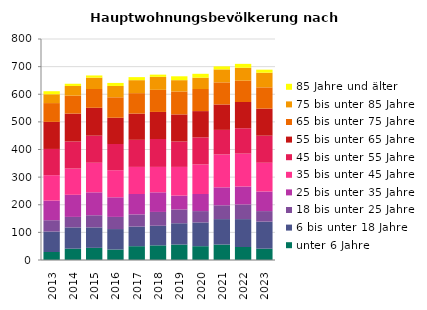
| Category | unter 6 Jahre | 6 bis unter 18 Jahre | 18 bis unter 25 Jahre | 25 bis unter 35 Jahre | 35 bis unter 45 Jahre | 45 bis unter 55 Jahre | 55 bis unter 65 Jahre | 65 bis unter 75 Jahre | 75 bis unter 85 Jahre | 85 Jahre und älter |
|---|---|---|---|---|---|---|---|---|---|---|
| 2013.0 | 29 | 74 | 41 | 71 | 92 | 95 | 98 | 68 | 32 | 11 |
| 2014.0 | 41 | 77 | 38 | 80 | 95 | 98 | 101 | 65 | 35 | 8 |
| 2015.0 | 44 | 74 | 44 | 83 | 107 | 98 | 101 | 68 | 41 | 8 |
| 2016.0 | 38 | 74 | 44 | 71 | 98 | 95 | 95 | 74 | 41 | 11 |
| 2017.0 | 50 | 71 | 44 | 74 | 98 | 98 | 95 | 74 | 47 | 11 |
| 2018.0 | 53 | 71 | 50 | 71 | 92 | 101 | 98 | 80 | 47 | 8 |
| 2019.0 | 56 | 77 | 50 | 50 | 104 | 92 | 98 | 83 | 41 | 14 |
| 2020.0 | 50 | 86 | 41 | 62 | 107 | 98 | 95 | 80 | 41 | 14 |
| 2021.0 | 56 | 92 | 50 | 65 | 119 | 89 | 92 | 80 | 47 | 11 |
| 2022.0 | 47 | 101 | 53 | 65 | 119 | 92 | 95 | 77 | 47 | 14 |
| 2023.0 | 41 | 98 | 38 | 71 | 104 | 98 | 98 | 77 | 53 | 11 |